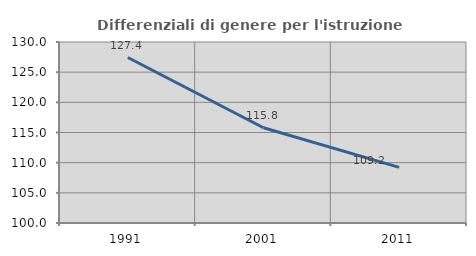
| Category | Differenziali di genere per l'istruzione superiore |
|---|---|
| 1991.0 | 127.427 |
| 2001.0 | 115.793 |
| 2011.0 | 109.224 |